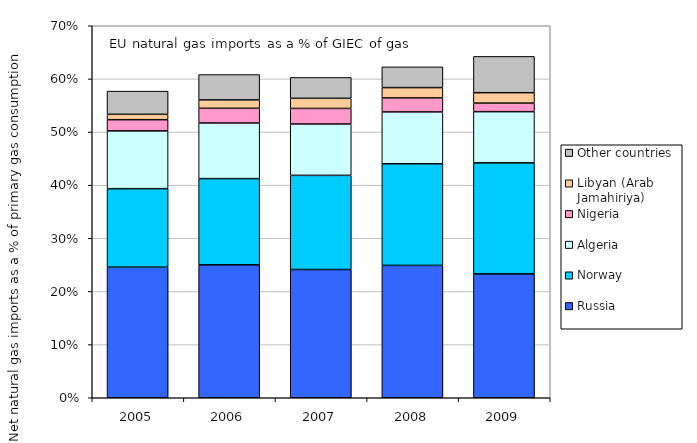
| Category | Russia | Norway | Algeria | Nigeria | Libyan (Arab Jamahiriya) | Other countries |
|---|---|---|---|---|---|---|
| 2005.0 | 0.246 | 0.148 | 0.109 | 0.021 | 0.01 | 0.044 |
| 2006.0 | 0.25 | 0.162 | 0.105 | 0.028 | 0.016 | 0.048 |
| 2007.0 | 0.241 | 0.177 | 0.097 | 0.029 | 0.019 | 0.039 |
| 2008.0 | 0.249 | 0.191 | 0.098 | 0.026 | 0.019 | 0.039 |
| 2009.0 | 0.233 | 0.209 | 0.096 | 0.016 | 0.02 | 0.068 |